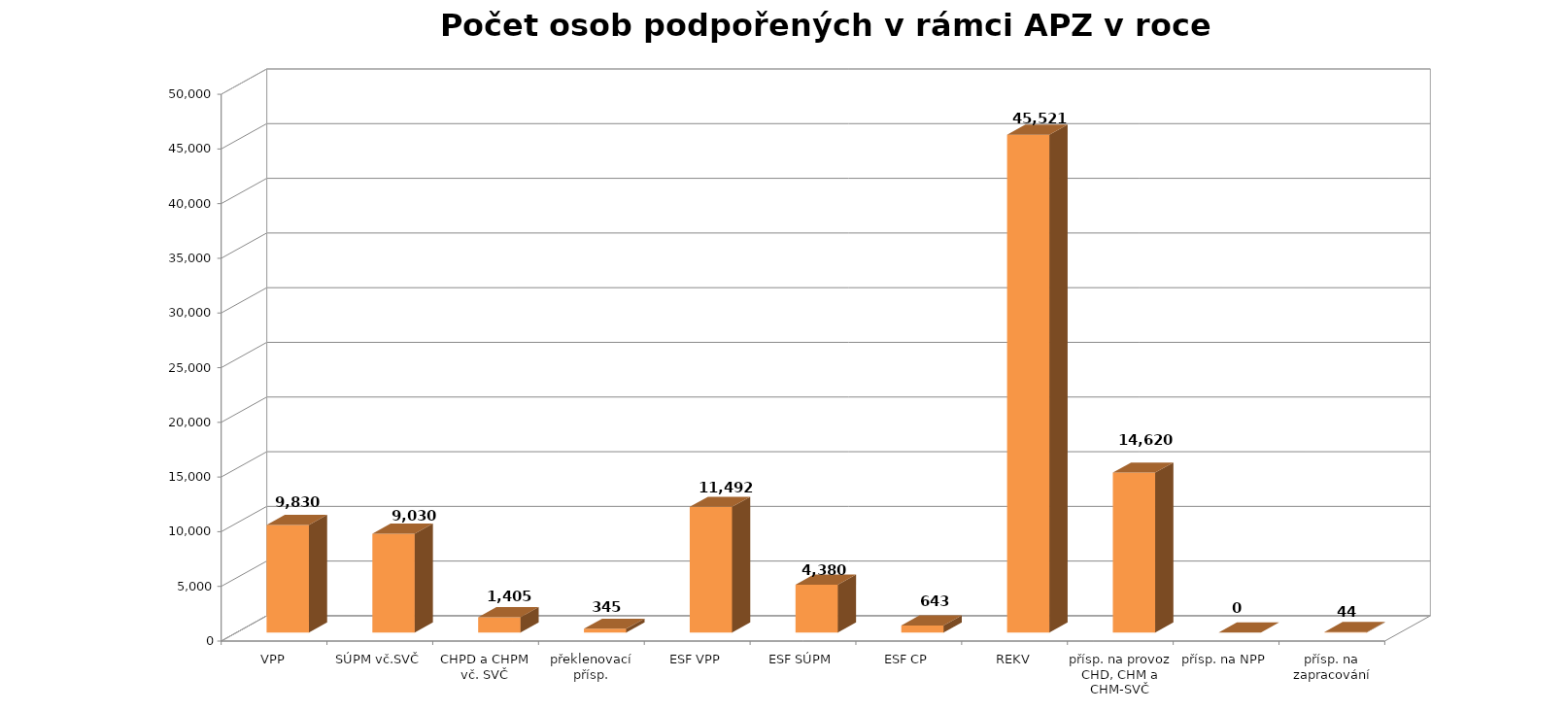
| Category | Series 0 |
|---|---|
| VPP | 9830 |
| SÚPM vč.SVČ | 9030 |
| CHPD a CHPM vč. SVČ | 1405 |
| překlenovací přísp. | 345 |
| ESF VPP | 11492 |
| ESF SÚPM | 4380 |
| ESF CP | 643 |
| REKV | 45521 |
| přísp. na provoz CHD, CHM a CHM-SVČ | 14620 |
| přísp. na NPP | 0 |
| přísp. na zapracování | 44 |